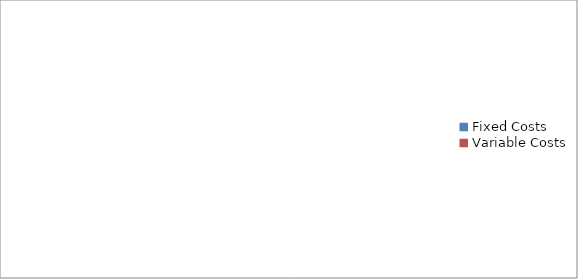
| Category | Series 0 |
|---|---|
| Fixed Costs | 0 |
| Variable Costs | 0 |